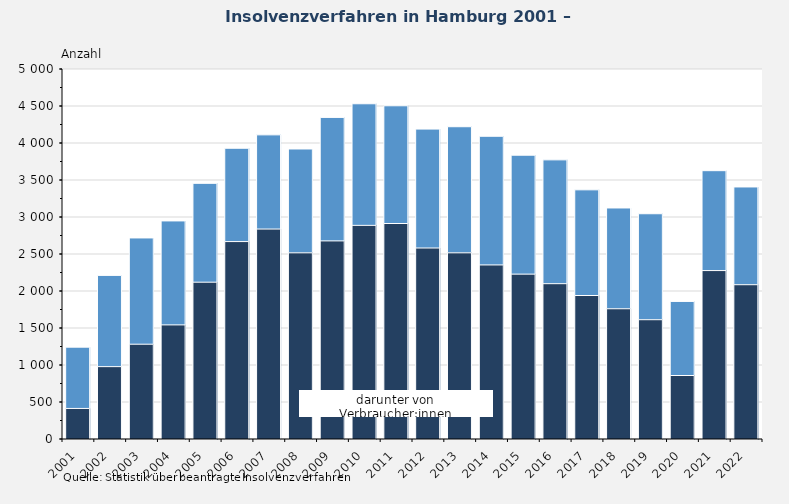
| Category | Insgesamt | darunter von Verbraucher:innen |
|---|---|---|
| 2001.0 | 1241 | 413 |
| 2002.0 | 2211 | 978 |
| 2003.0 | 2717 | 1281 |
| 2004.0 | 2947 | 1542 |
| 2005.0 | 3455 | 2119 |
| 2006.0 | 3929 | 2668 |
| 2007.0 | 4110 | 2837 |
| 2008.0 | 3919 | 2516 |
| 2009.0 | 4346 | 2677 |
| 2010.0 | 4530 | 2887 |
| 2011.0 | 4503 | 2912 |
| 2012.0 | 4188 | 2581 |
| 2013.0 | 4220 | 2516 |
| 2014.0 | 4091 | 2352 |
| 2015.0 | 3835 | 2228 |
| 2016.0 | 3772 | 2099 |
| 2017.0 | 3367 | 1939 |
| 2018.0 | 3122 | 1760 |
| 2019.0 | 3044 | 1612 |
| 2020.0 | 1859 | 858 |
| 2021.0 | 3626 | 2276 |
| 2022.0 | 3406 | 2085 |